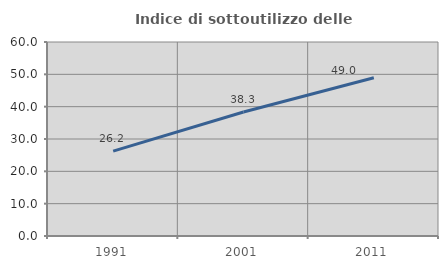
| Category | Indice di sottoutilizzo delle abitazioni  |
|---|---|
| 1991.0 | 26.234 |
| 2001.0 | 38.333 |
| 2011.0 | 48.956 |